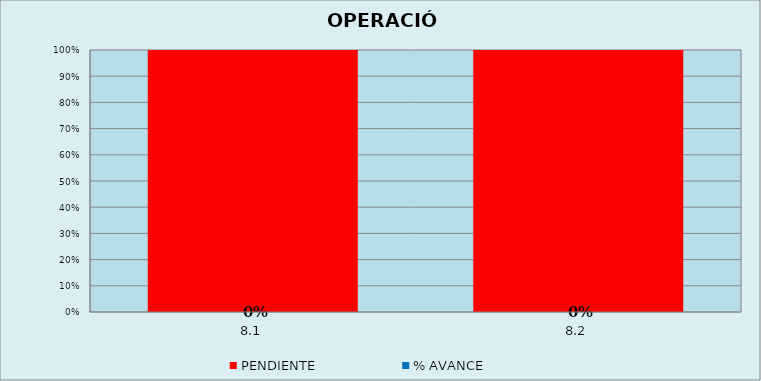
| Category | % AVANCE | PENDIENTE |
|---|---|---|
| 8.1 | 0 | 1 |
| 8.2 | 0 | 1 |